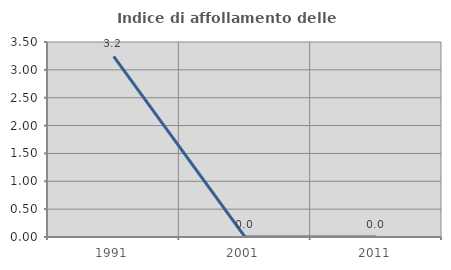
| Category | Indice di affollamento delle abitazioni  |
|---|---|
| 1991.0 | 3.243 |
| 2001.0 | 0 |
| 2011.0 | 0 |